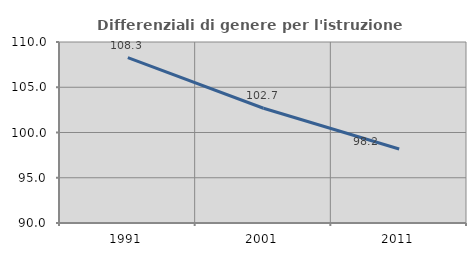
| Category | Differenziali di genere per l'istruzione superiore |
|---|---|
| 1991.0 | 108.275 |
| 2001.0 | 102.679 |
| 2011.0 | 98.182 |